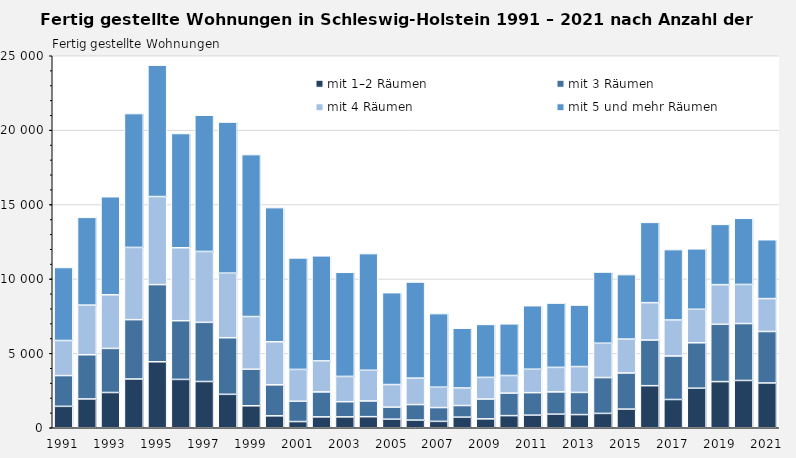
| Category | mit 1–2 Räumen | mit 3 Räumen | mit 4 Räumen | mit 5 und mehr Räumen |
|---|---|---|---|---|
| 1991.0 | 1439 | 2069 | 2355 | 4908 |
| 1992.0 | 1937 | 2969 | 3338 | 5896 |
| 1993.0 | 2370 | 2962 | 3605 | 6589 |
| 1994.0 | 3277 | 3989 | 4852 | 8996 |
| 1995.0 | 4435 | 5186 | 5917 | 8831 |
| 1996.0 | 3248 | 3946 | 4903 | 7676 |
| 1997.0 | 3109 | 3975 | 4764 | 9158 |
| 1998.0 | 2247 | 3804 | 4340 | 10152 |
| 1999.0 | 1478 | 2455 | 3541 | 10884 |
| 2000.0 | 802 | 2083 | 2895 | 9014 |
| 2001.0 | 417 | 1363 | 2140 | 7494 |
| 2002.0 | 731 | 1677 | 2084 | 7060 |
| 2003.0 | 731 | 1020 | 1698 | 6998 |
| 2004.0 | 745 | 1056 | 2063 | 7840 |
| 2005.0 | 575 | 812 | 1516 | 6175 |
| 2006.0 | 516 | 1043 | 1777 | 6458 |
| 2007.0 | 430 | 927 | 1369 | 4945 |
| 2008.0 | 713 | 781 | 1180 | 4016 |
| 2009.0 | 598 | 1331 | 1457 | 3558 |
| 2010.0 | 816 | 1510 | 1187 | 3469 |
| 2011.0 | 847 | 1512 | 1575 | 4269 |
| 2012.0 | 913 | 1497 | 1648 | 4320 |
| 2013.0 | 886 | 1489 | 1738 | 4132 |
| 2014.0 | 965 | 2408 | 2307 | 4784 |
| 2015.0 | 1253 | 2428 | 2279 | 4333 |
| 2016.0 | 2828 | 3067 | 2513 | 5395 |
| 2017.0 | 1899 | 2926 | 2417 | 4730 |
| 2018.0 | 2658 | 3053 | 2251 | 4063 |
| 2019.0 | 3101 | 3852 | 2665 | 4050 |
| 2020.0 | 3178 | 3826 | 2626 | 4447 |
| 2021.0 | 3010 | 3459 | 2210 | 3957 |